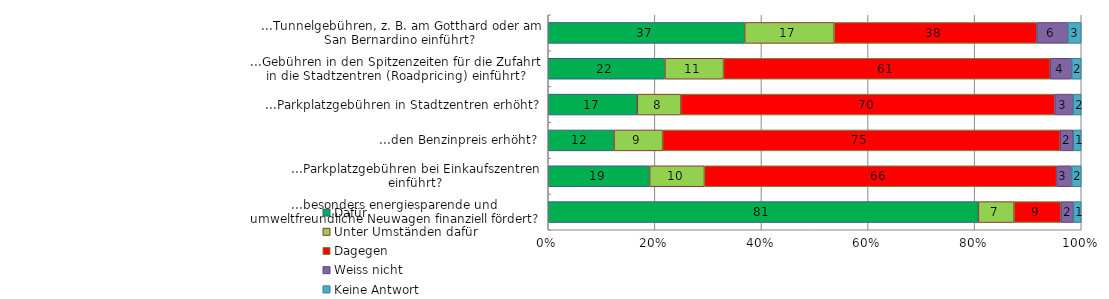
| Category | Dafür | Unter Umständen dafür | Dagegen | Weiss nicht | Keine Antwort |
|---|---|---|---|---|---|
| ...Tunnelgebühren, z. B. am Gotthard oder am San Bernardino einführt? | 36.851 | 16.805 | 38.018 | 5.812 | 2.515 |
| ...Gebühren in den Spitzenzeiten für die Zufahrt in die Stadtzentren (Roadpricing) einführt? | 21.88 | 11.007 | 61.296 | 4.033 | 1.784 |
| ...Parkplatzgebühren in Stadtzentren erhöht? | 16.708 | 8.164 | 70.18 | 3.418 | 1.53 |
| ...den Benzinpreis erhöht? | 12.337 | 9.129 | 74.593 | 2.446 | 1.495 |
| ...Parkplatzgebühren bei Einkaufszentren einführt? | 19.024 | 10.275 | 66.078 | 2.831 | 1.792 |
| ...besonders energiesparende und umweltfreundliche Neuwagen finanziell fördert? | 80.697 | 6.706 | 8.786 | 2.362 | 1.449 |